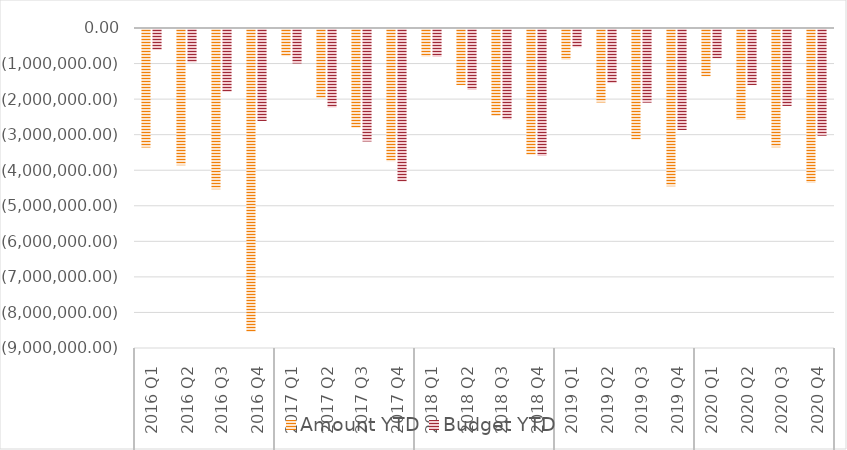
| Category | Amount YTD | Budget YTD |
|---|---|---|
| 0 | -3333406.81 | -586982.49 |
| 1 | -3830834.54 | -938956.38 |
| 2 | -4508796.12 | -1764990.45 |
| 3 | -8512255.63 | -2585023.11 |
| 4 | -763682.69 | -970034.55 |
| 5 | -1948749.74 | -2206031.47 |
| 6 | -2777514.91 | -3160682.83 |
| 7 | -3722148.73 | -4292355.5 |
| 8 | -776350.43 | -784567.59 |
| 9 | -1578975.05 | -1713696.09 |
| 10 | -2443954.56 | -2548211.58 |
| 11 | -3534963.98 | -3572974.39 |
| 12 | -865815.89 | -511758.73 |
| 13 | -2065596.08 | -1520428.96 |
| 14 | -3107306.62 | -2071876.49 |
| 15 | -4423173.82 | -2837754.23 |
| 16 | -1331309.07 | -822992.71 |
| 17 | -2556108.38 | -1577624.96 |
| 18 | -3327586 | -2164597.43 |
| 19 | -4332971.22 | -2999006.03 |